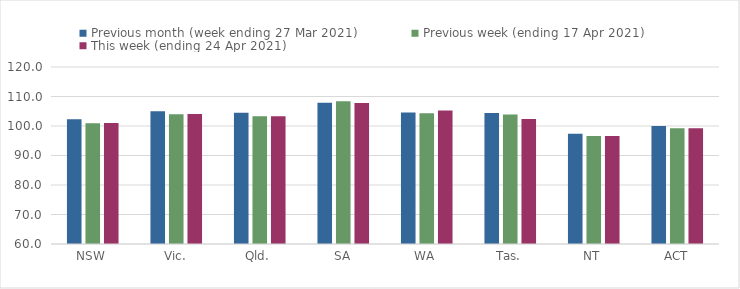
| Category | Previous month (week ending 27 Mar 2021) | Previous week (ending 17 Apr 2021) | This week (ending 24 Apr 2021) |
|---|---|---|---|
| NSW | 102.3 | 100.92 | 101.03 |
| Vic. | 104.96 | 103.99 | 104.04 |
| Qld. | 104.45 | 103.29 | 103.34 |
| SA | 107.92 | 108.38 | 107.8 |
| WA | 104.61 | 104.32 | 105.22 |
| Tas. | 104.38 | 103.86 | 102.37 |
| NT | 97.41 | 96.6 | 96.6 |
| ACT | 100 | 99.24 | 99.24 |